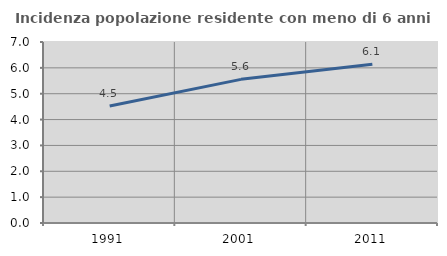
| Category | Incidenza popolazione residente con meno di 6 anni |
|---|---|
| 1991.0 | 4.524 |
| 2001.0 | 5.556 |
| 2011.0 | 6.142 |